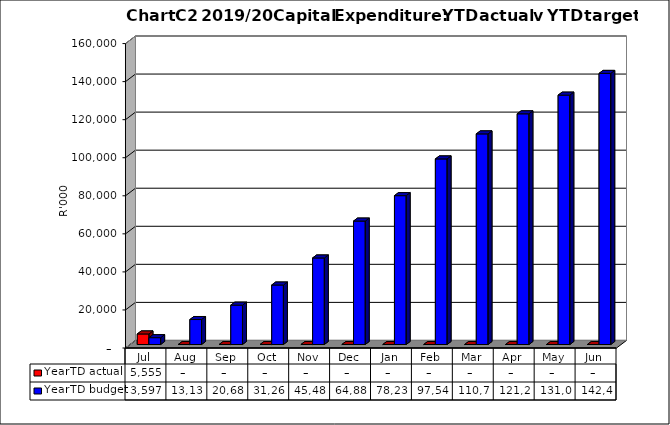
| Category | YearTD actual | YearTD budget |
|---|---|---|
| Jul | 5554740.23 | 3597000 |
| Aug | 0 | 13137000 |
| Sep | 0 | 20682000 |
| Oct | 0 | 31265000 |
| Nov | 0 | 45485000 |
| Dec | 0 | 64881000 |
| Jan | 0 | 78237000 |
| Feb | 0 | 97546000 |
| Mar | 0 | 110701000 |
| Apr | 0 | 121248000 |
| May | 0 | 131069000 |
| Jun | 0 | 142486000 |